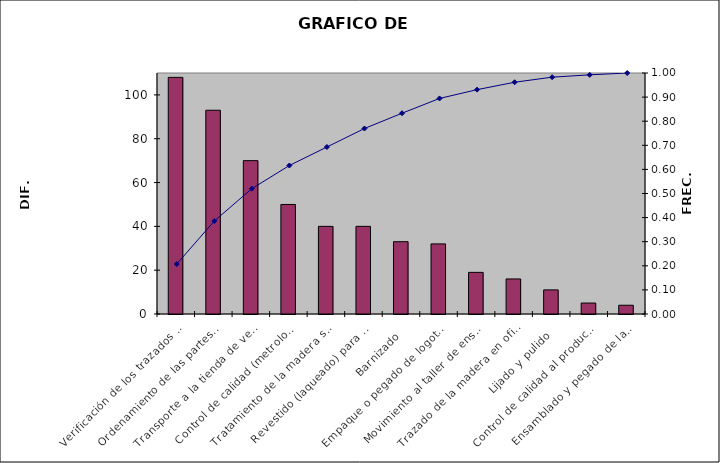
| Category | Diferencia TR-TS |
|---|---|
| Verificación de los trazados por el supervisor | 108 |
| Ordenamiento de las partes para ensamble | 93 |
| Transporte a la tienda de venta | 70 |
| Control de calidad (metrología de los trazados) | 50 |
| Tratamiento de la madera seca. | 40 |
| Revestido (laqueado) para proceso de pintura | 40 |
| Barnizado | 33 |
| Empaque o pegado de logotipo y cód. de barras | 32 |
| Movimiento al taller de ensamble | 19 |
| Trazado de la madera en oficina de diseño | 16 |
| Lijado y pulido | 11 |
| Control de calidad al producto acabado | 5 |
| Ensamblado y pegado de las partes | 4 |